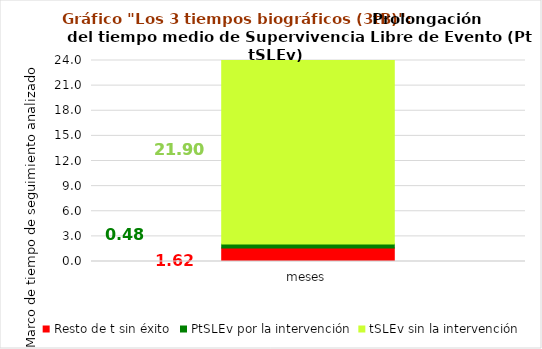
| Category | Resto de t sin éxito | PtSLEv por la intervención | tSLEv sin la intervención |
|---|---|---|---|
| meses | 1.619 | 0.484 | 21.897 |